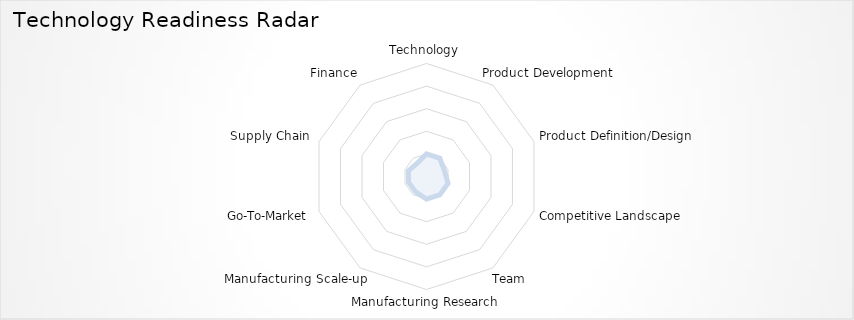
| Category | Series 0 |
|---|---|
| Technology | 0.2 |
| Product Development | 0.2 |
| Product Definition/Design | 0.167 |
| Competitive Landscape | 0.2 |
| Team | 0.2 |
| Manufacturing Research | 0.2 |
| Manufacturing Scale-up | 0.167 |
| Go-To-Market | 0.167 |
| Supply Chain | 0.167 |
| Finance | 0.143 |